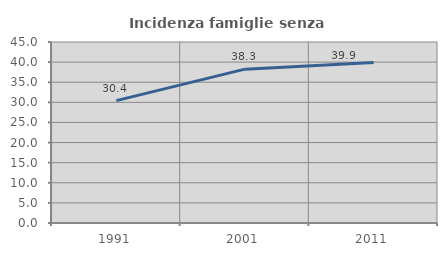
| Category | Incidenza famiglie senza nuclei |
|---|---|
| 1991.0 | 30.435 |
| 2001.0 | 38.255 |
| 2011.0 | 39.876 |